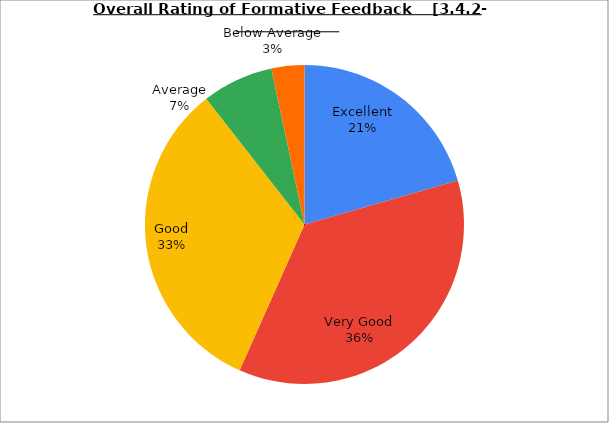
| Category | Series 0 |
|---|---|
| Excellent | 20.556 |
| Very Good | 36.111 |
| Good | 32.778 |
| Average | 7.222 |
| Below Average | 3.333 |